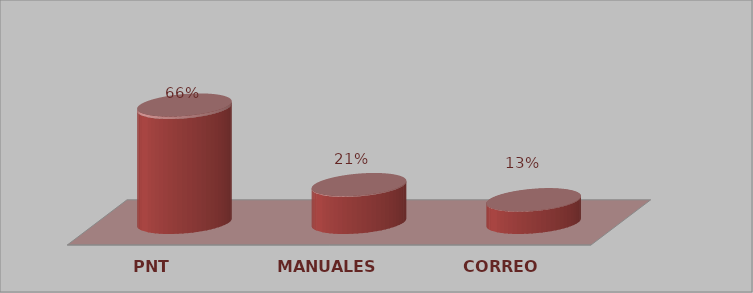
| Category | Series 0 | Series 1 |
|---|---|---|
| PNT | 31 | 0.66 |
| MANUALES | 10 | 0.213 |
| CORREO | 6 | 0.128 |